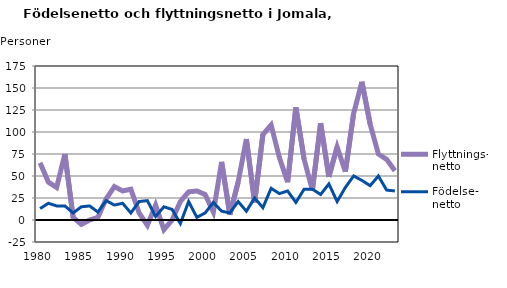
| Category | Flyttnings- netto | Födelse- netto |
|---|---|---|
| 1980.0 | 65 | 13 |
| 1981.0 | 43 | 19 |
| 1982.0 | 37 | 16 |
| 1983.0 | 75 | 16 |
| 1984.0 | 3 | 8 |
| 1985.0 | -5 | 15 |
| 1986.0 | 0 | 16 |
| 1987.0 | 3 | 9 |
| 1988.0 | 24 | 22 |
| 1989.0 | 38 | 17 |
| 1990.0 | 33 | 19 |
| 1991.0 | 35 | 8 |
| 1992.0 | 8 | 21 |
| 1993.0 | -6 | 22 |
| 1994.0 | 17 | 4 |
| 1995.0 | -11 | 15 |
| 1996.0 | 0 | 12 |
| 1997.0 | 21 | -4 |
| 1998.0 | 32 | 21 |
| 1999.0 | 33 | 3 |
| 2000.0 | 29 | 8 |
| 2001.0 | 9 | 20 |
| 2002.0 | 66 | 10 |
| 2003.0 | 6 | 8 |
| 2004.0 | 43 | 21 |
| 2005.0 | 92 | 10 |
| 2006.0 | 20 | 25 |
| 2007.0 | 97 | 14 |
| 2008.0 | 108 | 36 |
| 2009.0 | 71 | 30 |
| 2010.0 | 43 | 33 |
| 2011.0 | 128 | 20 |
| 2012.0 | 69 | 35 |
| 2013.0 | 34 | 35 |
| 2014.0 | 110 | 29 |
| 2015.0 | 49 | 41 |
| 2016.0 | 83 | 21 |
| 2017.0 | 55 | 37 |
| 2018.0 | 121 | 50 |
| 2019.0 | 157 | 45 |
| 2020.0 | 109 | 39 |
| 2021.0 | 75 | 50 |
| 2022.0 | 69 | 34 |
| 2023.0 | 56 | 33 |